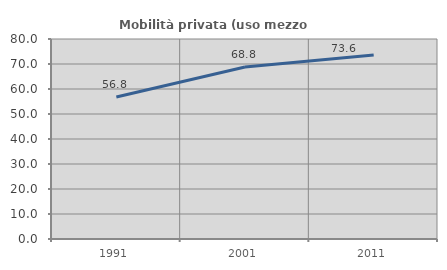
| Category | Mobilità privata (uso mezzo privato) |
|---|---|
| 1991.0 | 56.79 |
| 2001.0 | 68.771 |
| 2011.0 | 73.576 |